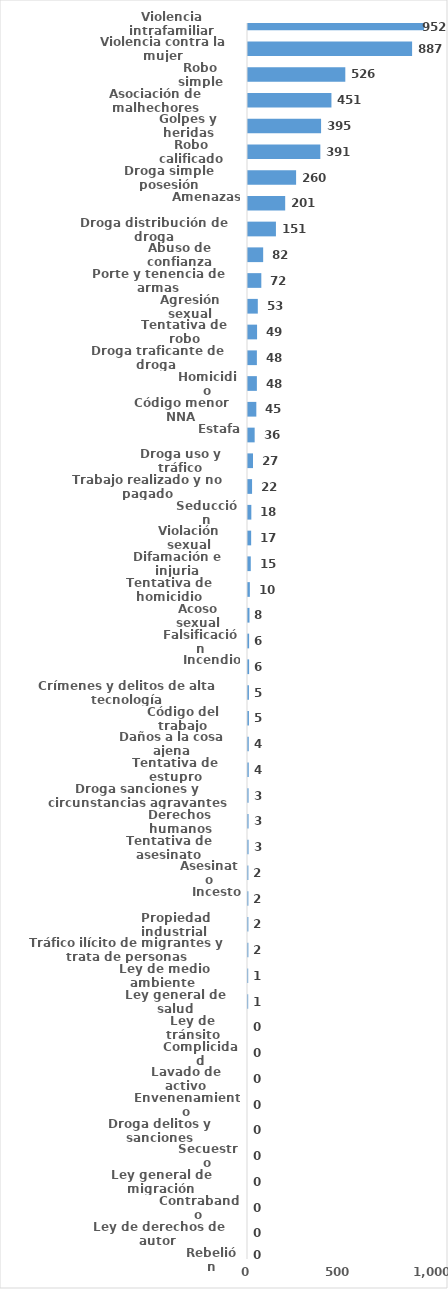
| Category | Series 0 |
|---|---|
| Violencia intrafamiliar | 952 |
| Violencia contra la mujer | 887 |
| Robo simple | 526 |
| Asociación de malhechores | 451 |
| Golpes y heridas | 395 |
| Robo calificado | 391 |
| Droga simple posesión | 260 |
| Amenazas | 201 |
| Droga distribución de droga | 151 |
| Abuso de confianza | 82 |
| Porte y tenencia de armas | 72 |
| Agresión sexual | 53 |
| Tentativa de robo | 49 |
| Droga traficante de droga  | 48 |
| Homicidio | 48 |
| Código menor NNA | 45 |
| Estafa | 36 |
| Droga uso y tráfico | 27 |
| Trabajo realizado y no pagado | 22 |
| Seducción | 18 |
| Violación sexual | 17 |
| Difamación e injuria | 15 |
| Tentativa de homicidio | 10 |
| Acoso sexual | 8 |
| Falsificación | 6 |
| Incendio | 6 |
| Crímenes y delitos de alta tecnología | 5 |
| Código del trabajo | 5 |
| Daños a la cosa ajena | 4 |
| Tentativa de estupro | 4 |
| Droga sanciones y circunstancias agravantes | 3 |
| Derechos humanos | 3 |
| Tentativa de asesinato | 3 |
| Asesinato | 2 |
| Incesto | 2 |
| Propiedad industrial  | 2 |
| Tráfico ilícito de migrantes y trata de personas | 2 |
| Ley de medio ambiente  | 1 |
| Ley general de salud | 1 |
| Ley de tránsito | 0 |
| Complicidad | 0 |
| Lavado de activo | 0 |
| Envenenamiento | 0 |
| Droga delitos y sanciones | 0 |
| Secuestro | 0 |
| Ley general de migración | 0 |
| Contrabando | 0 |
| Ley de derechos de autor  | 0 |
| Rebelión | 0 |